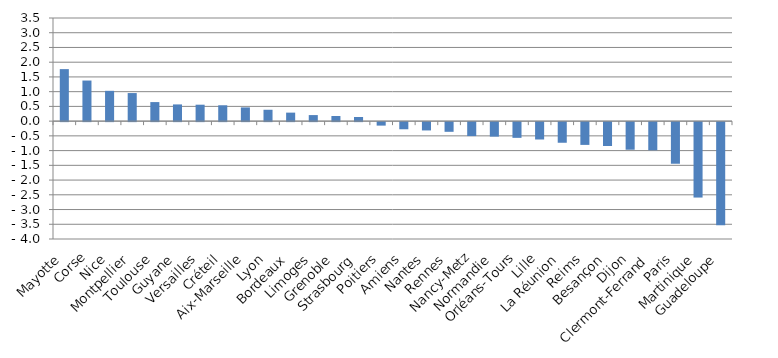
| Category | Évolution en % |
|---|---|
| Mayotte | 1.765 |
| Corse | 1.378 |
| Nice | 1.028 |
| Montpellier | 0.953 |
| Toulouse | 0.646 |
| Guyane | 0.567 |
| Versailles | 0.558 |
| Créteil | 0.538 |
| Aix-Marseille | 0.466 |
| Lyon | 0.386 |
| Bordeaux | 0.289 |
| Limoges | 0.205 |
| Grenoble | 0.173 |
| Strasbourg | 0.14 |
| Poitiers | -0.118 |
| Amiens | -0.242 |
| Nantes | -0.282 |
| Rennes | -0.328 |
| Nancy-Metz | -0.473 |
| Normandie | -0.492 |
| Orléans-Tours | -0.533 |
| Lille | -0.589 |
| La Réunion | -0.7 |
| Reims | -0.773 |
| Besançon | -0.811 |
| Dijon | -0.936 |
| Clermont-Ferrand | -0.955 |
| Paris | -1.412 |
| Martinique | -2.559 |
| Guadeloupe | -3.499 |